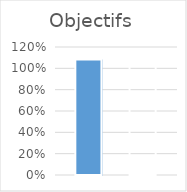
| Category | Series 0 | Series 1 | Series 2 |
|---|---|---|---|
| 0 | 1.083 | 0 | 1.083 |